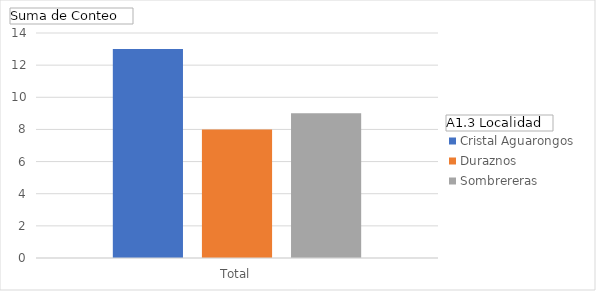
| Category | Cristal Aguarongos  | Duraznos | Sombrereras  |
|---|---|---|---|
| Total | 13 | 8 | 9 |